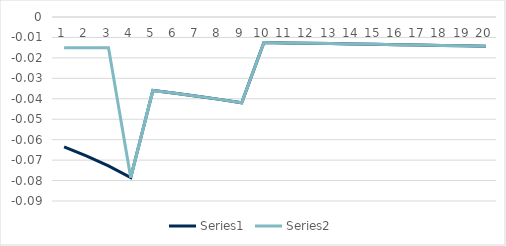
| Category | Series 0 | Series 1 |
|---|---|---|
| 0 | -0.064 | -0.015 |
| 1 | -0.068 | -0.015 |
| 2 | -0.073 | -0.015 |
| 3 | -0.079 | -0.079 |
| 4 | -0.036 | -0.036 |
| 5 | -0.037 | -0.037 |
| 6 | -0.039 | -0.039 |
| 7 | -0.04 | -0.04 |
| 8 | -0.042 | -0.042 |
| 9 | -0.013 | -0.013 |
| 10 | -0.013 | -0.013 |
| 11 | -0.013 | -0.013 |
| 12 | -0.013 | -0.013 |
| 13 | -0.013 | -0.013 |
| 14 | -0.013 | -0.013 |
| 15 | -0.014 | -0.014 |
| 16 | -0.014 | -0.014 |
| 17 | -0.014 | -0.014 |
| 18 | -0.014 | -0.014 |
| 19 | -0.014 | -0.014 |